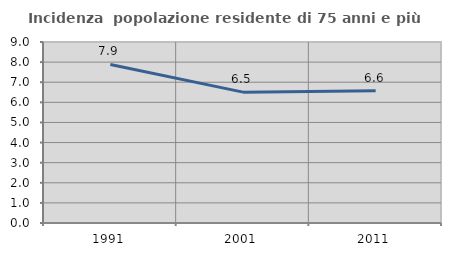
| Category | Incidenza  popolazione residente di 75 anni e più |
|---|---|
| 1991.0 | 7.885 |
| 2001.0 | 6.507 |
| 2011.0 | 6.571 |